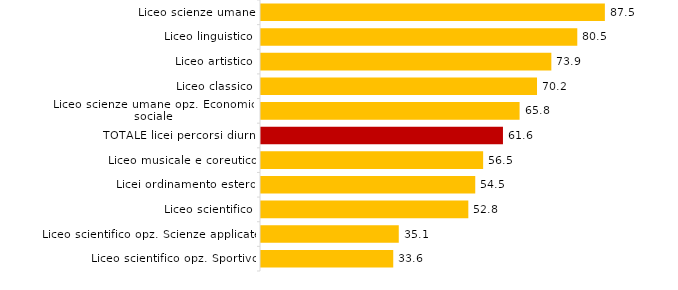
| Category | Quota Fem. |
|---|---|
| Liceo scientifico opz. Sportivo | 33.65 |
| Liceo scientifico opz. Scienze applicate | 35.056 |
| Liceo scientifico | 52.754 |
| Licei ordinamento estero | 54.516 |
| Liceo musicale e coreutico | 56.525 |
| TOTALE licei percorsi diurni | 61.567 |
| Liceo scienze umane opz. Economico sociale | 65.797 |
| Liceo classico | 70.234 |
| Liceo artistico | 73.879 |
| Liceo linguistico | 80.48 |
| Liceo scienze umane | 87.499 |